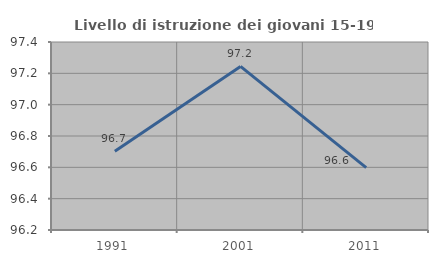
| Category | Livello di istruzione dei giovani 15-19 anni |
|---|---|
| 1991.0 | 96.703 |
| 2001.0 | 97.244 |
| 2011.0 | 96.599 |